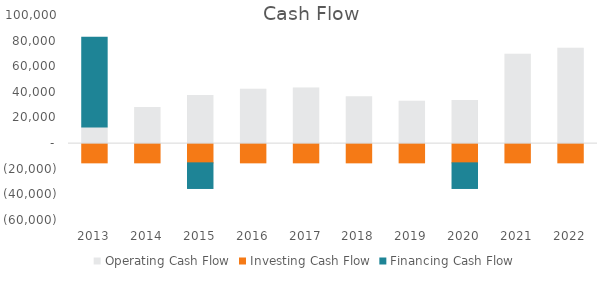
| Category |  Operating Cash Flow  |  Investing Cash Flow  |  Financing Cash Flow  |
|---|---|---|---|
| 2013.0 | 12971.179 | -15000 | 70000 |
| 2014.0 | 28238.733 | -15000 | 0 |
| 2015.0 | 37505.344 | -15000 | -20000 |
| 2016.0 | 42354.079 | -15000 | 0 |
| 2017.0 | 43480.185 | -15000 | 0 |
| 2018.0 | 36500.355 | -15000 | 0 |
| 2019.0 | 33124.752 | -15000 | 0 |
| 2020.0 | 33652.124 | -15000 | -20000 |
| 2021.0 | 69849.249 | -15000 | 0 |
| 2022.0 | 74464.042 | -15000 | 0 |